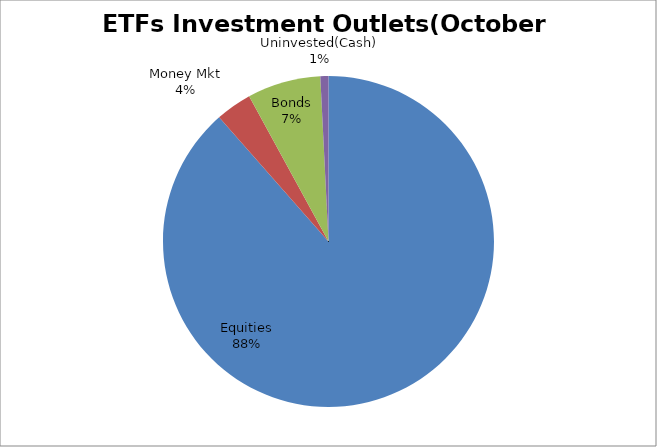
| Category | Series 0 |
|---|---|
| Equities | 4987236106.21 |
| Money Mkt | 199138352.45 |
| Bonds | 403914182.01 |
| Uninvested(Cash) | 44490229.24 |